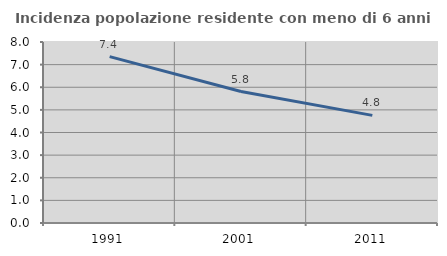
| Category | Incidenza popolazione residente con meno di 6 anni |
|---|---|
| 1991.0 | 7.354 |
| 2001.0 | 5.81 |
| 2011.0 | 4.757 |